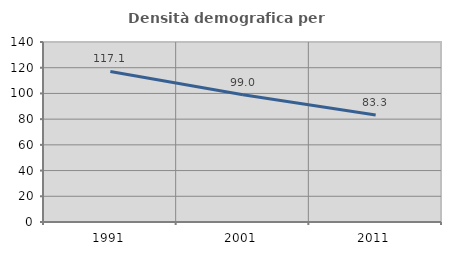
| Category | Densità demografica |
|---|---|
| 1991.0 | 117.118 |
| 2001.0 | 99.011 |
| 2011.0 | 83.297 |